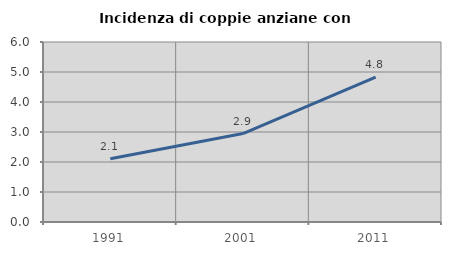
| Category | Incidenza di coppie anziane con figli |
|---|---|
| 1991.0 | 2.109 |
| 2001.0 | 2.95 |
| 2011.0 | 4.831 |